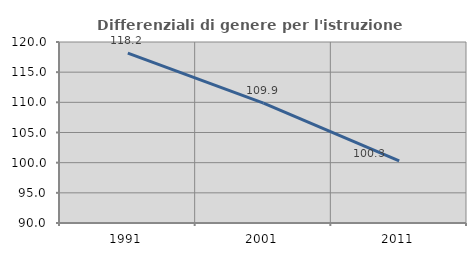
| Category | Differenziali di genere per l'istruzione superiore |
|---|---|
| 1991.0 | 118.15 |
| 2001.0 | 109.873 |
| 2011.0 | 100.298 |